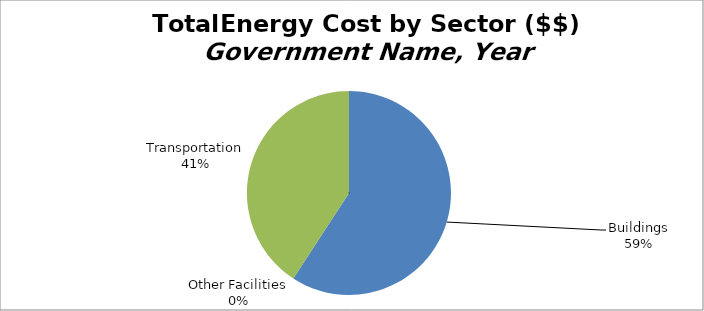
| Category | Series 0 |
|---|---|
| Buildings | 59.193 |
| Other Facilities | 0 |
| Transportation | 40.807 |